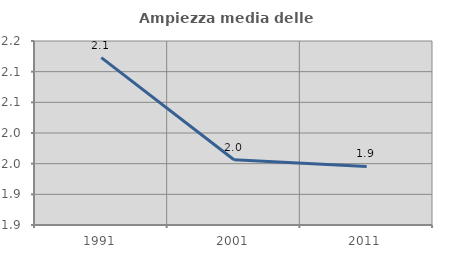
| Category | Ampiezza media delle famiglie |
|---|---|
| 1991.0 | 2.123 |
| 2001.0 | 1.956 |
| 2011.0 | 1.945 |